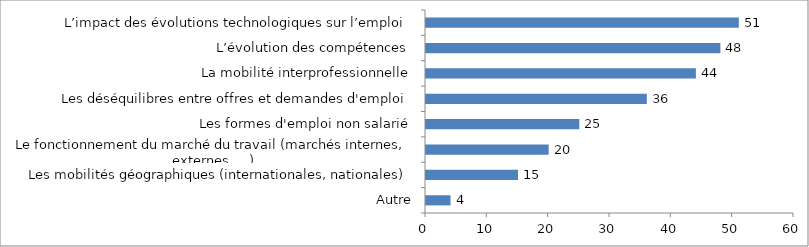
| Category | Series 0 |
|---|---|
| Autre | 4 |
| Les mobilités géographiques (internationales, nationales) | 15 |
| Le fonctionnement du marché du travail (marchés internes, externes, ...) | 20 |
| Les formes d'emploi non salarié | 25 |
| Les déséquilibres entre offres et demandes d'emploi | 36 |
| La mobilité interprofessionnelle | 44 |
| L’évolution des compétences | 48 |
| L’impact des évolutions technologiques sur l’emploi | 51 |